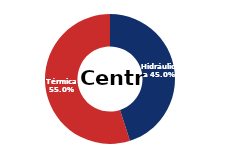
| Category | Centro |
|---|---|
| Eólica | 0 |
| Hidráulica | 1737.456 |
| Solar | 0.006 |
| Térmica | 2121.166 |